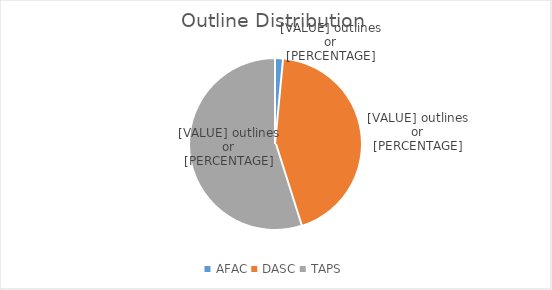
| Category | Series 0 |
|---|---|
| AFAC | 2 |
| DASC | 58 |
| TAPS | 73 |